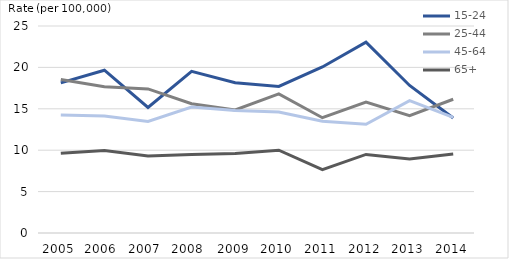
| Category | 15-24 | 25-44 | 45-64 | 65+ |
|---|---|---|---|---|
| 2005 | 18.126 | 18.535 | 14.244 | 9.639 |
| 2006  | 19.659 | 17.673 | 14.116 | 9.969 |
| 2007  | 15.157 | 17.401 | 13.472 | 9.309 |
| 2008  | 19.522 | 15.617 | 15.213 | 9.474 |
| 2009 | 18.143 | 14.867 | 14.783 | 9.592 |
| 2010 | 17.702 | 16.8 | 14.6 | 10 |
| 2011 | 20.056 | 13.926 | 13.493 | 7.657 |
| 2012 | 23.047 | 15.815 | 13.124 | 9.488 |
| 2013 | 17.819 | 14.161 | 15.982 | 8.942 |
| 2014 | 13.895 | 16.156 | 13.954 | 9.531 |